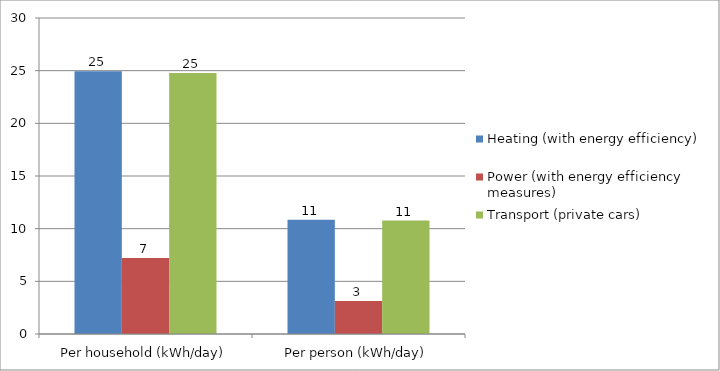
| Category | Heating (with energy efficiency) | Power (with energy efficiency measures) | Transport (private cars) |
|---|---|---|---|
| Per household (kWh/day) | 24.938 | 7.22 | 24.782 |
| Per person (kWh/day) | 10.842 | 3.139 | 10.775 |